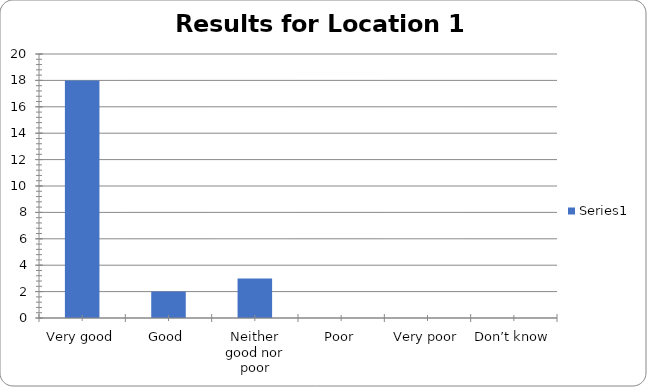
| Category | Series 0 |
|---|---|
| Very good | 18 |
| Good | 2 |
| Neither good nor poor | 3 |
| Poor | 0 |
| Very poor | 0 |
| Don’t know | 0 |